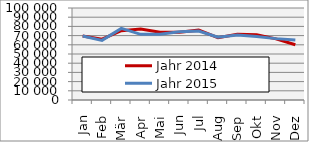
| Category | Jahr 2014 | Jahr 2015 |
|---|---|---|
| Jan | 69636.552 | 69556.042 |
| Feb | 66189.607 | 64801.668 |
| Mär | 75306.791 | 77814.499 |
| Apr | 77107.505 | 71345.651 |
| Mai | 73641.853 | 71575.004 |
| Jun | 73565.166 | 74188.468 |
| Jul | 75929.435 | 75008.527 |
| Aug | 67750.894 | 68236.319 |
| Sep | 71361.688 | 70599.622 |
| Okt | 70832.815 | 69062.934 |
| Nov | 66459.177 | 66713.201 |
| Dez | 60058.815 | 65283.496 |